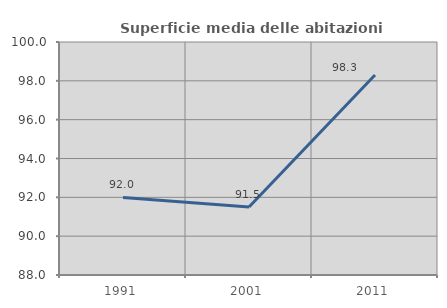
| Category | Superficie media delle abitazioni occupate |
|---|---|
| 1991.0 | 91.995 |
| 2001.0 | 91.504 |
| 2011.0 | 98.298 |